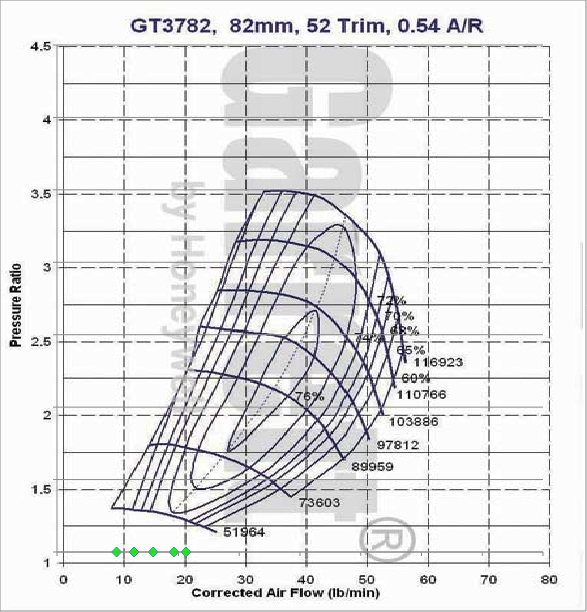
| Category | Series 0 |
|---|---|
| 9.80439105130732 | 1 |
| 12.668531043555387 | 1 |
| 15.835663804444236 | 1 |
| 19.237398992065582 | 1 |
| 21.225654558623585 | 1 |